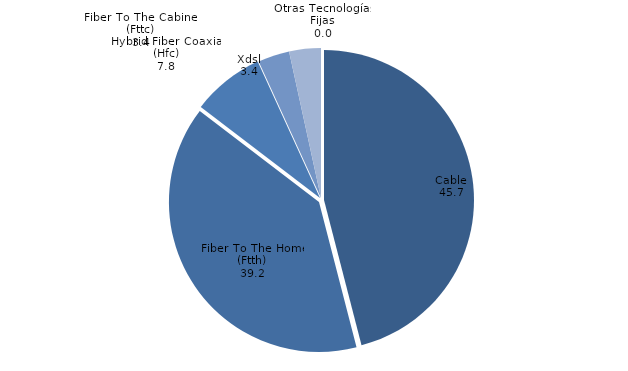
| Category | Series 0 |
|---|---|
| Cable | 45.735 |
| Fiber To The Home (Ftth) | 39.194 |
| Hybrid Fiber Coaxial (Hfc) | 7.765 |
| Xdsl | 3.387 |
| Fiber To The Cabinet (Fttc) | 3.396 |
| Otras Tecnologías Fijas | 0.001 |